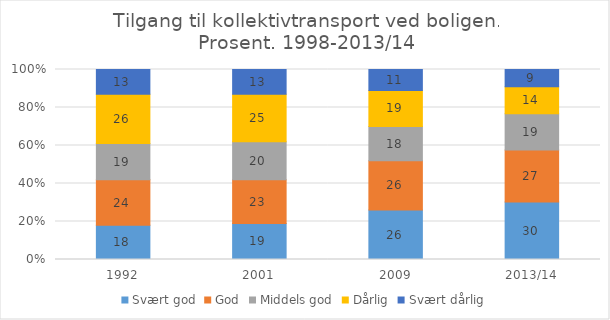
| Category | Svært god | God | Middels god | Dårlig | Svært dårlig |
|---|---|---|---|---|---|
| 1992 | 18 | 24 | 19 | 26 | 13 |
| 2001 | 19 | 23 | 20 | 25 | 13 |
| 2009 | 26 | 26 | 18 | 19 | 11 |
| 2013/14 | 30 | 27 | 19 | 14 | 9 |